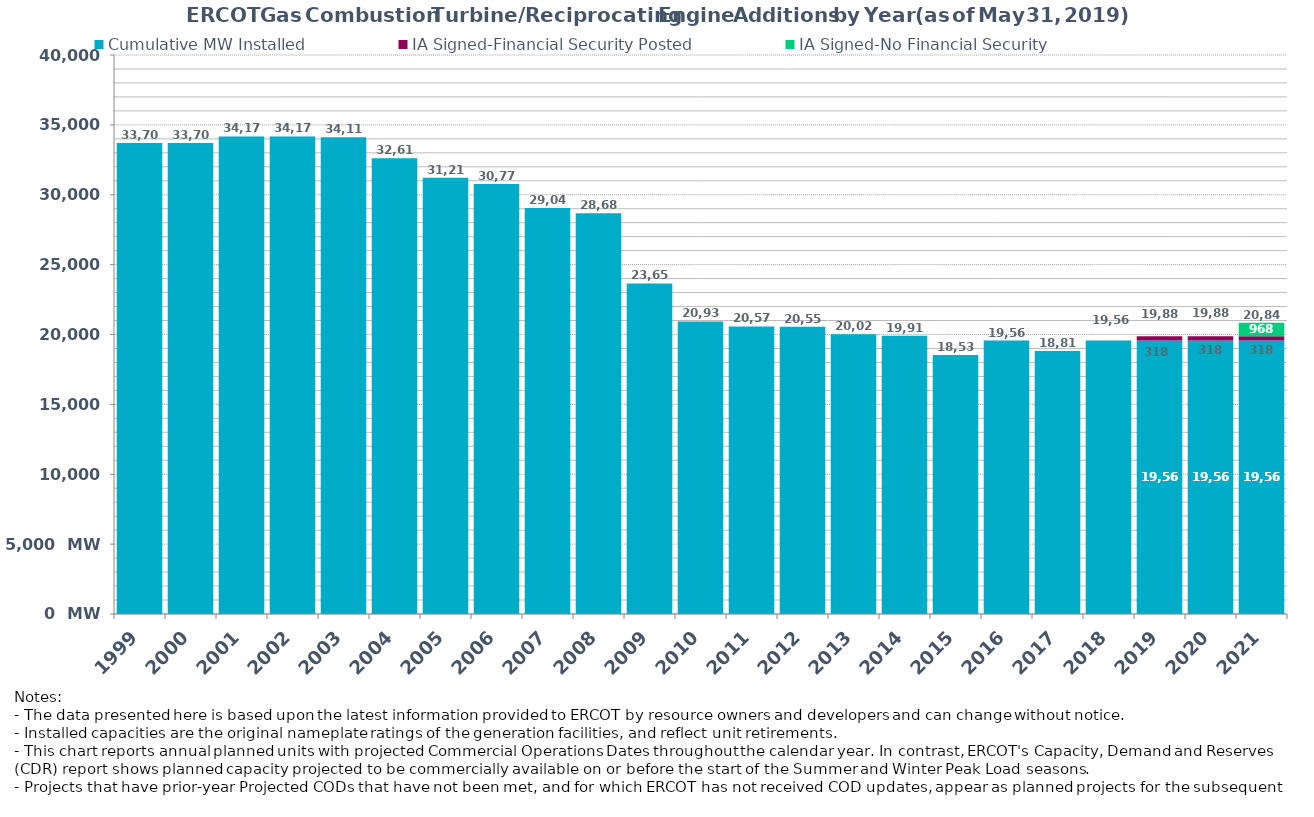
| Category | Cumulative MW Installed | IA Signed-Financial Security Posted  | IA Signed-No Financial Security  | Cumulative Installed and Planned |
|---|---|---|---|---|
| 1999.0 | 33703 | 0 | 0 | 33703 |
| 2000.0 | 33703 | 0 | 0 | 33703 |
| 2001.0 | 34170 | 0 | 0 | 34170 |
| 2002.0 | 34170 | 0 | 0 | 34170 |
| 2003.0 | 34118 | 0 | 0 | 34118 |
| 2004.0 | 32616 | 0 | 0 | 32616 |
| 2005.0 | 31217 | 0 | 0 | 31217 |
| 2006.0 | 30774 | 0 | 0 | 30774 |
| 2007.0 | 29048 | 0 | 0 | 29048 |
| 2008.0 | 28681 | 0 | 0 | 28681 |
| 2009.0 | 23651 | 0 | 0 | 23651 |
| 2010.0 | 20937 | 0 | 0 | 20937 |
| 2011.0 | 20575 | 0 | 0 | 20575 |
| 2012.0 | 20551 | 0 | 0 | 20551 |
| 2013.0 | 20026 | 0 | 0 | 20026 |
| 2014.0 | 19917 | 0 | 0 | 19917 |
| 2015.0 | 18538 | 0 | 0 | 18538 |
| 2016.0 | 19564 | 0 | 0 | 19564 |
| 2017.0 | 18818 | 0 | 0 | 18818 |
| 2018.0 | 19562 | 0 | 0 | 19562 |
| 2019.0 | 19562 | 318 | 0 | 19880 |
| 2020.0 | 19562 | 318 | 0 | 19880 |
| 2021.0 | 19562 | 318 | 968 | 20848 |